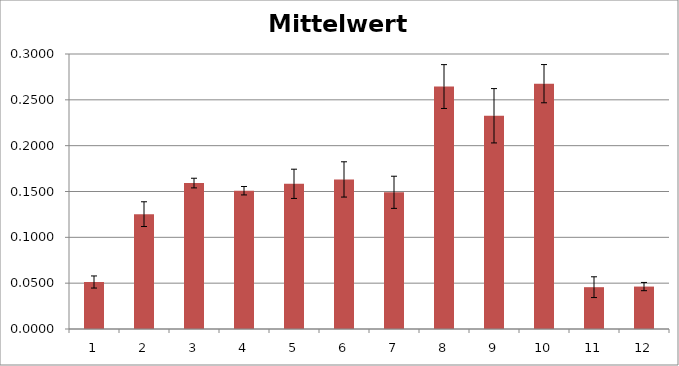
| Category | Mittelwert korriigert |
|---|---|
| 0 | 0.051 |
| 1 | 0.125 |
| 2 | 0.159 |
| 3 | 0.151 |
| 4 | 0.158 |
| 5 | 0.163 |
| 6 | 0.149 |
| 7 | 0.264 |
| 8 | 0.233 |
| 9 | 0.268 |
| 10 | 0.046 |
| 11 | 0.046 |